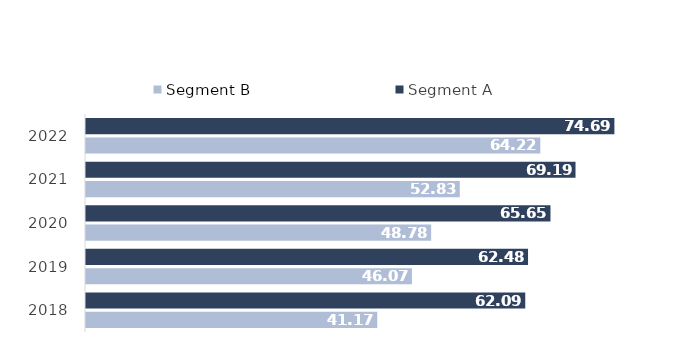
| Category | Segment B | Segment A |
|---|---|---|
| 2018.0 | 41.171 | 62.086 |
| 2019.0 | 46.067 | 62.48 |
| 2020.0 | 48.783 | 65.65 |
| 2021.0 | 52.83 | 69.19 |
| 2022.0 | 64.218 | 74.685 |